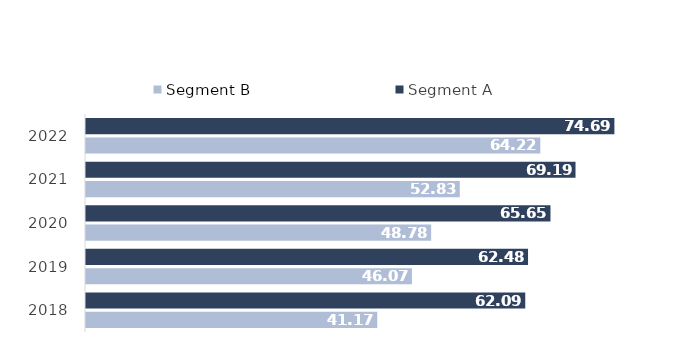
| Category | Segment B | Segment A |
|---|---|---|
| 2018.0 | 41.171 | 62.086 |
| 2019.0 | 46.067 | 62.48 |
| 2020.0 | 48.783 | 65.65 |
| 2021.0 | 52.83 | 69.19 |
| 2022.0 | 64.218 | 74.685 |